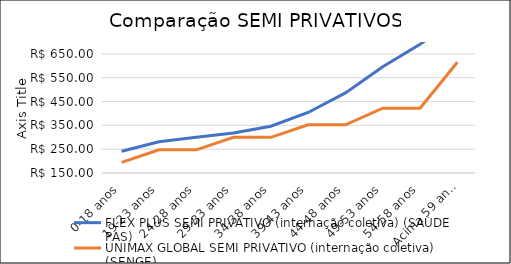
| Category | FLEX PLUS SEMI PRIVATIVO (internação coletiva) (SAÚDE PAS) | UNIMAX GLOBAL SEMI PRIVATIVO (internação coletiva) (SENGE) |
|---|---|---|
| 0-18 anos | 241.04 | 194.72 |
| 19-23 anos | 281.45 | 247.23 |
| 24-28 anos | 300.21 | 247.23 |
| 29-33 anos | 317.54 | 299.77 |
| 34-38 anos | 346.4 | 299.77 |
| 39-43 anos | 404.14 | 352.28 |
| 44-48 anos | 486.35 | 352.28 |
| 49-53 anos | 596.17 | 422.29 |
| 54-58 anos | 690.3 | 422.29 |
| Acima 59 anos | 800.12 | 614.69 |